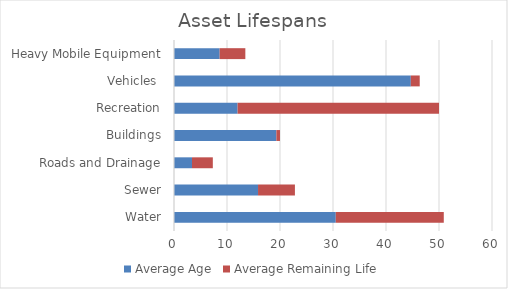
| Category | Average Age | Average Remaining Life |
|---|---|---|
| Water | 30.523 | 20.379 |
| Sewer | 15.855 | 6.96 |
| Roads and Drainage | 3.398 | 3.927 |
| Buildings | 19.314 | 0.686 |
| Recreation | 12 | 38 |
| Vehicles  | 44.68 | 1.684 |
| Heavy Mobile Equipment | 8.616 | 4.845 |